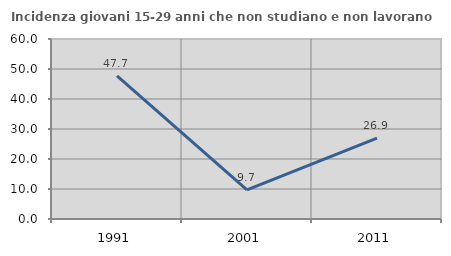
| Category | Incidenza giovani 15-29 anni che non studiano e non lavorano  |
|---|---|
| 1991.0 | 47.687 |
| 2001.0 | 9.677 |
| 2011.0 | 26.923 |